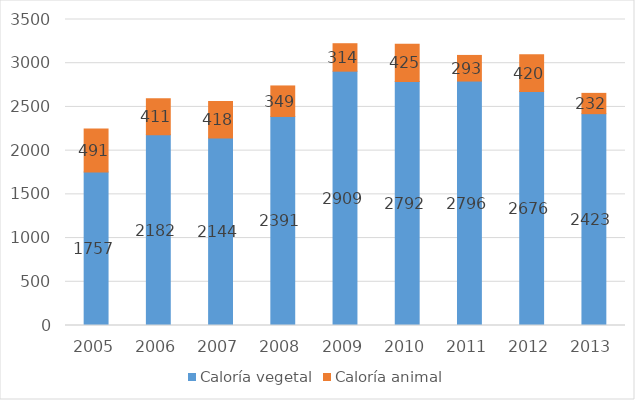
| Category | Caloría vegetal | Caloría animal |
|---|---|---|
| 2005.0 | 1757 | 491 |
| 2006.0 | 2182 | 411 |
| 2007.0 | 2144 | 418 |
| 2008.0 | 2391 | 349 |
| 2009.0 | 2909 | 314 |
| 2010.0 | 2792 | 425 |
| 2011.0 | 2796 | 293 |
| 2012.0 | 2676 | 420 |
| 2013.0 | 2423 | 232 |